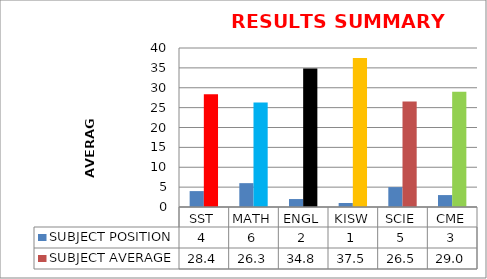
| Category | SUBJECT POSITION | SUBJECT AVERAGE |
|---|---|---|
| SST | 4 | 28.375 |
| MATH | 6 | 26.292 |
| ENGL | 2 | 34.833 |
| KISW | 1 | 37.458 |
| SCIE | 5 | 26.542 |
| CME | 3 | 29 |